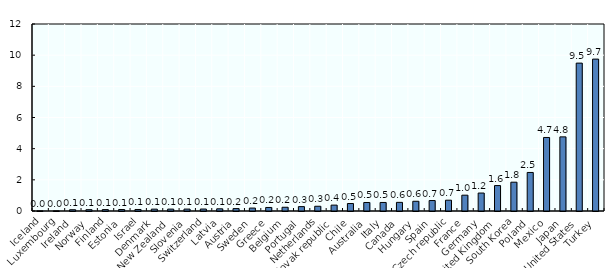
| Category | Series1 |
|---|---|
| Iceland | 0.007 |
| Luxembourg | 0.007 |
| Ireland | 0.081 |
| Norway | 0.084 |
| Finland | 0.091 |
| Estonia | 0.095 |
| Israel | 0.097 |
| Denmark | 0.12 |
| New Zealand | 0.121 |
| Slovenia | 0.124 |
| Switzerland | 0.127 |
| Latvia | 0.14 |
| Austria | 0.154 |
| Sweden | 0.188 |
| Greece | 0.227 |
| Belgium | 0.24 |
| Portugal | 0.281 |
| Netherlands | 0.304 |
| Slovak republic | 0.377 |
| Chile | 0.479 |
| Australia | 0.546 |
| Italy | 0.548 |
| Canada | 0.554 |
| Hungary | 0.625 |
| Spain | 0.671 |
| Czech republic | 0.693 |
| France | 1.015 |
| Germany | 1.152 |
| United Kingdom | 1.632 |
| South Korea | 1.849 |
| Poland | 2.473 |
| Mexico | 4.718 |
| Japan | 4.757 |
| United States | 9.49 |
| Turkey | 9.747 |